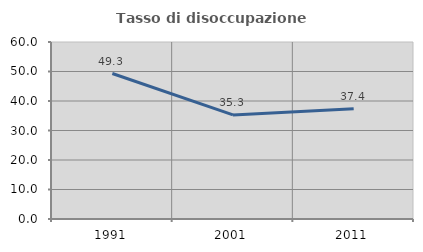
| Category | Tasso di disoccupazione giovanile  |
|---|---|
| 1991.0 | 49.309 |
| 2001.0 | 35.294 |
| 2011.0 | 37.398 |